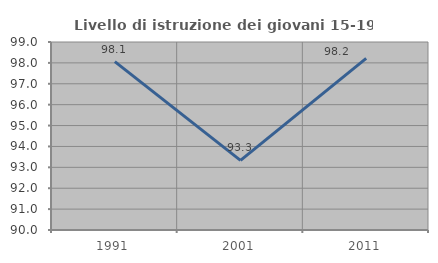
| Category | Livello di istruzione dei giovani 15-19 anni |
|---|---|
| 1991.0 | 98.058 |
| 2001.0 | 93.333 |
| 2011.0 | 98.214 |